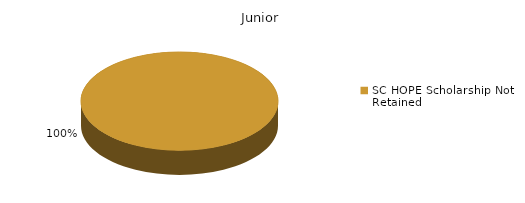
| Category | Junior |
|---|---|
| SC HOPE Scholarship Not Retained  | 1 |